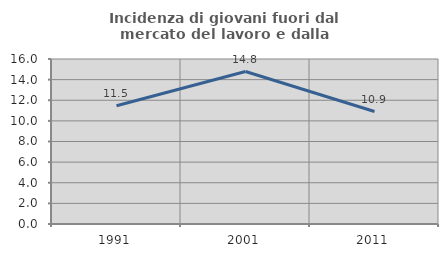
| Category | Incidenza di giovani fuori dal mercato del lavoro e dalla formazione  |
|---|---|
| 1991.0 | 11.465 |
| 2001.0 | 14.783 |
| 2011.0 | 10.909 |